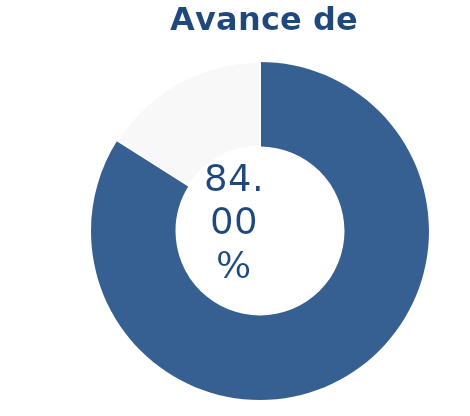
| Category | Series 0 |
|---|---|
| Acumulado 1 Trimestre | 0.84 |
| Año | -0.16 |